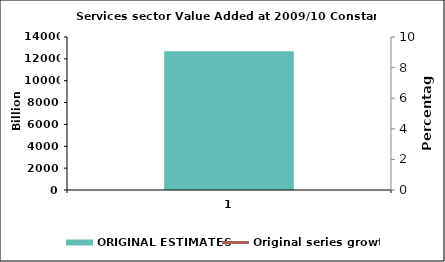
| Category | ORIGINAL ESTIMATES |
|---|---|
| 0 | 12685.304 |